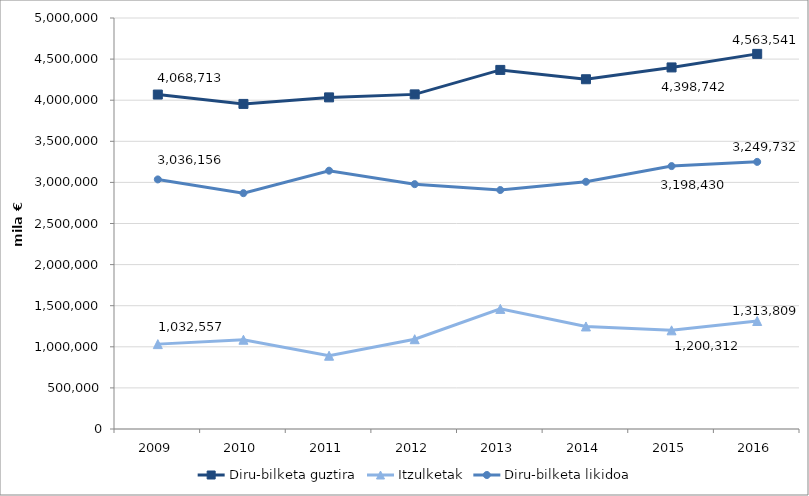
| Category | Diru-bilketa guztira | Itzulketak | Diru-bilketa likidoa |
|---|---|---|---|
| 2009.0 | 4068712.882 | 1032557.036 | 3036155.845 |
| 2010.0 | 3954897.595 | 1085991.918 | 2868905.677 |
| 2011.0 | 4034191.014 | 891687.288 | 3142503.727 |
| 2012.0 | 4070844.381 | 1092254.555 | 2978589.826 |
| 2013.0 | 4368385.495 | 1461255.497 | 2907129.998 |
| 2014.0 | 4255033.664 | 1247467.968 | 3007565.696 |
| 2015.0 | 4398741.824 | 1200312.032 | 3198429.792 |
| 2016.0 | 4563540.838 | 1313808.981 | 3249731.857 |